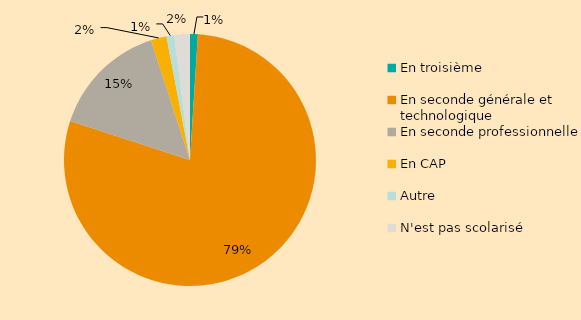
| Category | Filière de scolarisation |
|---|---|
| En troisième | 0.01 |
| En seconde générale et technologique | 0.79 |
| En seconde professionnelle | 0.15 |
| En CAP | 0.02 |
| Autre | 0.01 |
| N'est pas scolarisé | 0.02 |